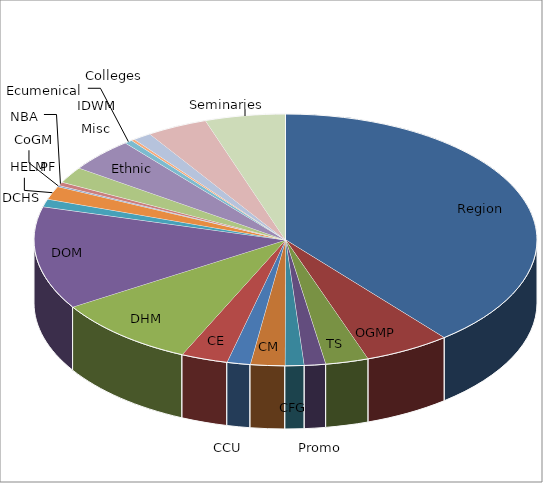
| Category | Series 0 |
|---|---|
| Region | 10107.83 |
| OGMP | 1431.945 |
| TS | 713.084 |
| Promo | 355.681 |
| CFG | 312.014 |
| CM | 570.963 |
| CCU | 386.149 |
| CE | 775.389 |
| DHM | 2405.548 |
| DOM | 3406.76 |
| DCHS | 259.673 |
| HELM | 441.567 |
| CoGM | 41.22 |
| NBA | 118.288 |
| PF | 539.577 |
| Ethnic | 1116.429 |
| Ecumenical | 131.157 |
| Misc | 58.859 |
| IDWM | 305.89 |
| Colleges | 1012.166 |
| Seminaries | 1330.897 |